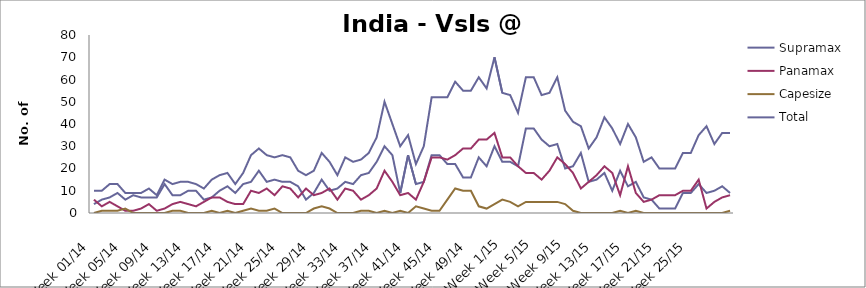
| Category | Supramax | Panamax | Capesize | Total |
|---|---|---|---|---|
| Week 01/14 | 4 | 6 | 0 | 10 |
| Week 02/14 | 6 | 3 | 1 | 10 |
| Week 03/14 | 7 | 5 | 1 | 13 |
| Week 04/14 | 9 | 3 | 1 | 13 |
| Week 05/14 | 6 | 1 | 2 | 9 |
| Week 06/14 | 8 | 1 | 0 | 9 |
| Week 07/14 | 7 | 2 | 0 | 9 |
| Week 08/14 | 7 | 4 | 0 | 11 |
| Week 09/14 | 7 | 1 | 0 | 8 |
| Week 10/14 | 13 | 2 | 0 | 15 |
| Week 11/14 | 8 | 4 | 1 | 13 |
| Week 12/14 | 8 | 5 | 1 | 14 |
| Week 13/14 | 10 | 4 | 0 | 14 |
| Week 14/14 | 10 | 3 | 0 | 13 |
| Week 15/14 | 6 | 5 | 0 | 11 |
| Week 16/14 | 7 | 7 | 1 | 15 |
| Week 17/14 | 10 | 7 | 0 | 17 |
| Week 18/14 | 12 | 5 | 1 | 18 |
| Week 19/14 | 9 | 4 | 0 | 13 |
| Week 20/14 | 13 | 4 | 1 | 18 |
| Week 21/14 | 14 | 10 | 2 | 26 |
| Week 22/14 | 19 | 9 | 1 | 29 |
| Week 23/14 | 14 | 11 | 1 | 26 |
| Week 24/14 | 15 | 8 | 2 | 25 |
| Week 25/14 | 14 | 12 | 0 | 26 |
| Week 26/14 | 14 | 11 | 0 | 25 |
| Week 27/14 | 12 | 7 | 0 | 19 |
| Week 28/14 | 6 | 11 | 0 | 17 |
| Week 29/14 | 9 | 8 | 2 | 19 |
| Week 30/14 | 15 | 9 | 3 | 27 |
| Week 31/14 | 10 | 11 | 2 | 23 |
| Week 32/14 | 11 | 6 | 0 | 17 |
| Week 33/14 | 14 | 11 | 0 | 25 |
| Week 34/14 | 13 | 10 | 0 | 23 |
| Week 35/14 | 17 | 6 | 1 | 24 |
| Week 36/14 | 18 | 8 | 1 | 27 |
| Week 37/14 | 23 | 11 | 0 | 34 |
| Week 38/14 | 30 | 19 | 1 | 50 |
| Week 39/14 | 26 | 14 | 0 | 40 |
| Week 40/14 | 9 | 8 | 1 | 30 |
| Week 41/14 | 26 | 9 | 0 | 35 |
| Week 42/14 | 13 | 6 | 3 | 22 |
| Week 43/14 | 14 | 14 | 2 | 30 |
| Week 44/14 | 26 | 25 | 1 | 52 |
| Week 45/14 | 26 | 25 | 1 | 52 |
| Week 46/14 | 22 | 24 | 6 | 52 |
| Week 47/14 | 22 | 26 | 11 | 59 |
| Week 48/14 | 16 | 29 | 10 | 55 |
| Week 49/14 | 16 | 29 | 10 | 55 |
| Week 50/14 | 25 | 33 | 3 | 61 |
| Week 51/14 | 21 | 33 | 2 | 56 |
| Week 52/14 | 30 | 36 | 4 | 70 |
| Week 1/15 | 23 | 25 | 6 | 54 |
| Week 2/15 | 23 | 25 | 5 | 53 |
| Week 3/15 | 21 | 21 | 3 | 45 |
| Week 4/15 | 38 | 18 | 5 | 61 |
| Week 5/15 | 38 | 18 | 5 | 61 |
| Week 6/15 | 33 | 15 | 5 | 53 |
| Week 7/15 | 30 | 19 | 5 | 54 |
| Week 8/15 | 31 | 25 | 5 | 61 |
| Week 9/15 | 20 | 22 | 4 | 46 |
| Week 10/15 | 21 | 18 | 1 | 41 |
| Week 11/15 | 27 | 11 | 0 | 39 |
| Week 12/15 | 14 | 14 | 0 | 29 |
| Week 13/15 | 15 | 17 | 0 | 34 |
| Week 14/15 | 18 | 21 | 0 | 43 |
| Week 15/15 | 10 | 18 | 0 | 38 |
| Week 16/15 | 19 | 8 | 1 | 31 |
| Week 17/15 | 12 | 21 | 0 | 40 |
| Week 18/15 | 14 | 9 | 1 | 34 |
| Week 19/15 | 7 | 5 | 0 | 23 |
| Week 20/15 | 6 | 6 | 0 | 25 |
| Week 21/15 | 2 | 8 | 0 | 20 |
| Week 22/15 | 2 | 8 | 0 | 20 |
| Week 23/15 | 2 | 8 | 0 | 20 |
| Week 24/15 | 9 | 10 | 0 | 27 |
| Week 25/15 | 9 | 10 | 0 | 27 |